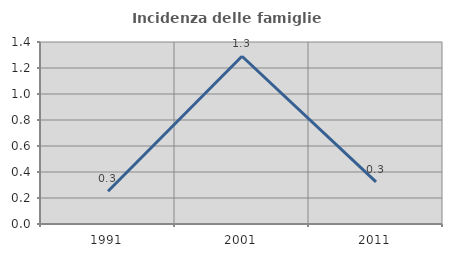
| Category | Incidenza delle famiglie numerose |
|---|---|
| 1991.0 | 0.252 |
| 2001.0 | 1.29 |
| 2011.0 | 0.324 |